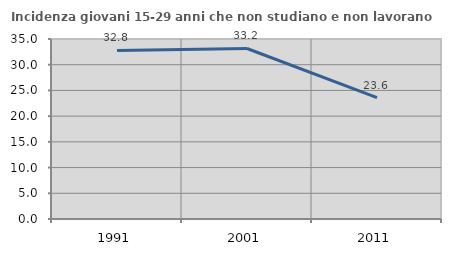
| Category | Incidenza giovani 15-29 anni che non studiano e non lavorano  |
|---|---|
| 1991.0 | 32.773 |
| 2001.0 | 33.155 |
| 2011.0 | 23.602 |